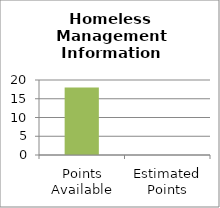
| Category | Homeless Management Information System |
|---|---|
| Points Available | 18 |
| Estimated Points | 0 |